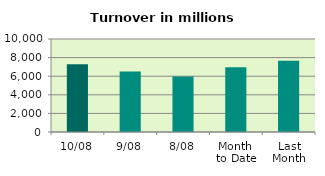
| Category | Series 0 |
|---|---|
| 10/08 | 7290.419 |
| 9/08 | 6518.547 |
| 8/08 | 5968.988 |
| Month 
to Date | 6962.895 |
| Last
Month | 7648.819 |